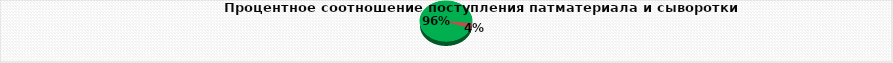
| Category |  методом ПЦР |
|---|---|
| 0 | 1830 |
| 1 | 74 |